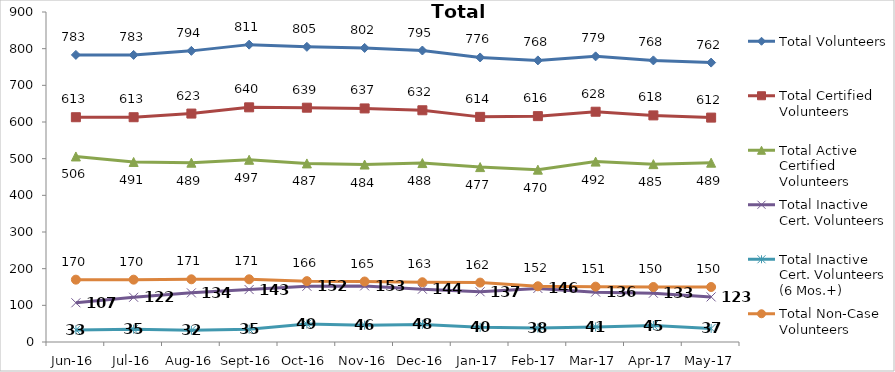
| Category | Total Volunteers | Total Certified Volunteers | Total Active Certified Volunteers | Total Inactive Cert. Volunteers | Total Inactive Cert. Volunteers (6 Mos.+) | Total Non-Case Volunteers |
|---|---|---|---|---|---|---|
| Jun-16 | 783 | 613 | 506 | 107 | 33 | 170 |
| Jul-16 | 783 | 613 | 491 | 122 | 35 | 170 |
| Aug-16 | 794 | 623 | 489 | 134 | 32 | 171 |
| Sep-16 | 811 | 640 | 497 | 143 | 35 | 171 |
| Oct-16 | 805 | 639 | 487 | 152 | 49 | 166 |
| Nov-16 | 802 | 637 | 484 | 153 | 46 | 165 |
| Dec-16 | 795 | 632 | 488 | 144 | 48 | 163 |
| Jan-17 | 776 | 614 | 477 | 137 | 40 | 162 |
| Feb-17 | 768 | 616 | 470 | 146 | 38 | 152 |
| Mar-17 | 779 | 628 | 492 | 136 | 41 | 151 |
| Apr-17 | 768 | 618 | 485 | 133 | 45 | 150 |
| May-17 | 762 | 612 | 489 | 123 | 37 | 150 |